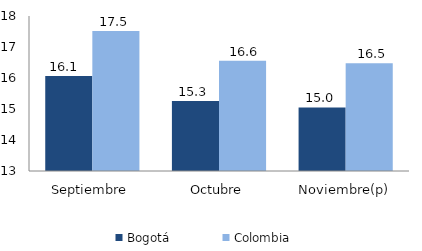
| Category | Bogotá | Colombia |
|---|---|---|
| Septiembre | 16.066 | 17.519 |
| Octubre | 15.259 | 16.559 |
| Noviembre(p) | 15.049 | 16.479 |